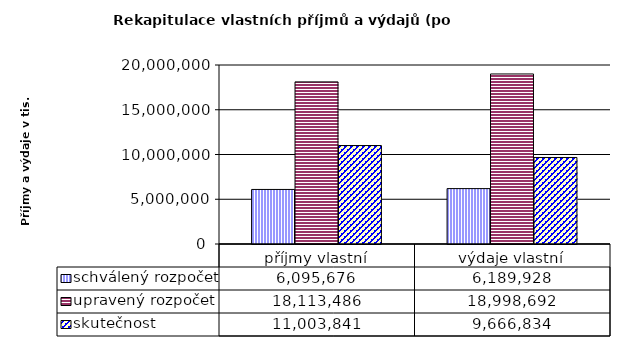
| Category | schválený rozpočet | upravený rozpočet | skutečnost |
|---|---|---|---|
| příjmy vlastní | 6095676 | 18113486 | 11003841 |
| výdaje vlastní | 6189928 | 18998692 | 9666834 |